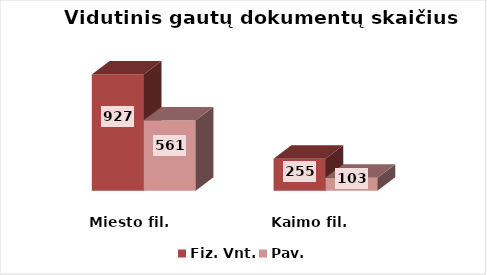
| Category | Fiz. Vnt. | Pav. |
|---|---|---|
| Miesto fil. | 927 | 561.3 |
| Kaimo fil. | 255 | 103 |